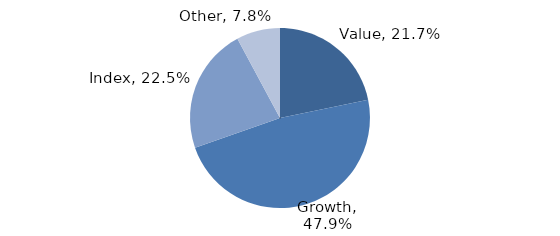
| Category | Investment Style |
|---|---|
| Value | 0.217 |
| Growth | 0.479 |
| Index | 0.225 |
| Other | 0.078 |